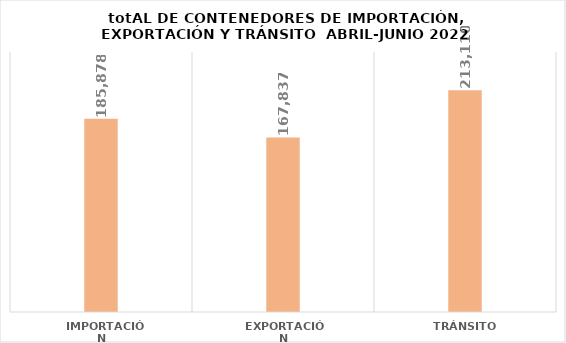
| Category | Series 0 |
|---|---|
|  IMPORTACIÓN | 185878 |
| EXPORTACIÓN | 167837 |
| TRÁNSITO | 213110 |